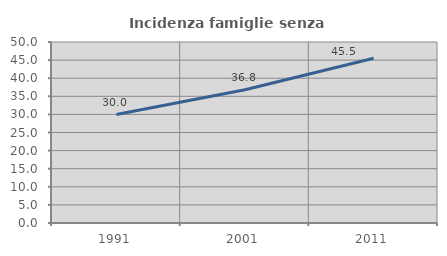
| Category | Incidenza famiglie senza nuclei |
|---|---|
| 1991.0 | 29.968 |
| 2001.0 | 36.788 |
| 2011.0 | 45.526 |